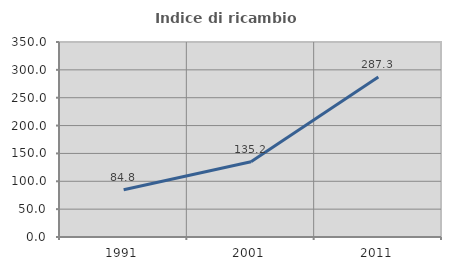
| Category | Indice di ricambio occupazionale  |
|---|---|
| 1991.0 | 84.756 |
| 2001.0 | 135.156 |
| 2011.0 | 287.342 |